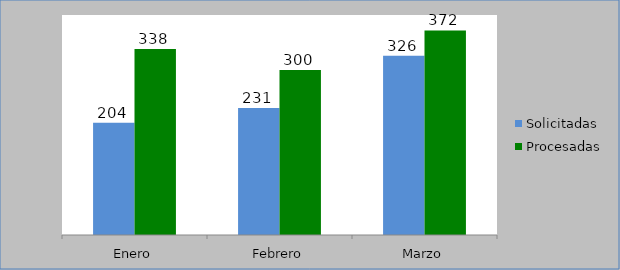
| Category | Solicitadas | Procesadas |
|---|---|---|
| Enero | 204 | 338 |
| Febrero | 231 | 300 |
| Marzo | 326 | 372 |